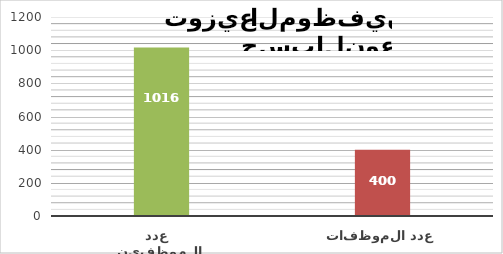
| Category | Series 1 |
|---|---|
| عدد الموظفين   | 1016 |
| عدد الموظفات   | 400 |